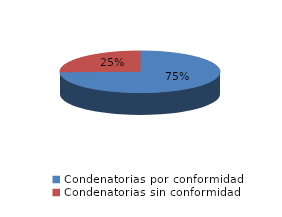
| Category | Series 0 |
|---|---|
| 0 | 62 |
| 1 | 21 |